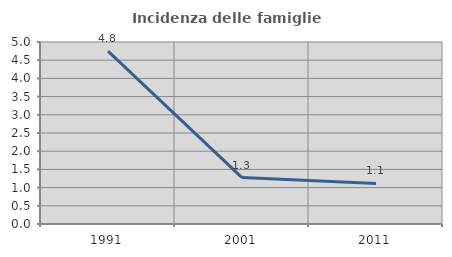
| Category | Incidenza delle famiglie numerose |
|---|---|
| 1991.0 | 4.75 |
| 2001.0 | 1.276 |
| 2011.0 | 1.114 |